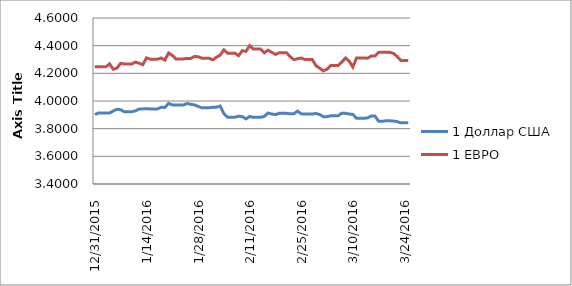
| Category | 1 Доллар США | 1 ЕВРО |
|---|---|---|
| 12/31/15 | 3.902 | 4.247 |
| 1/1/16 | 3.913 | 4.247 |
| 1/2/16 | 3.913 | 4.247 |
| 1/3/16 | 3.913 | 4.247 |
| 1/4/16 | 3.913 | 4.269 |
| 1/5/16 | 3.928 | 4.229 |
| 1/6/16 | 3.941 | 4.238 |
| 1/7/16 | 3.937 | 4.273 |
| 1/8/16 | 3.922 | 4.268 |
| 1/9/16 | 3.922 | 4.268 |
| 1/10/16 | 3.922 | 4.268 |
| 1/11/16 | 3.929 | 4.281 |
| 1/12/16 | 3.942 | 4.274 |
| 1/13/16 | 3.943 | 4.262 |
| 1/14/16 | 3.944 | 4.312 |
| 1/15/16 | 3.943 | 4.303 |
| 1/16/16 | 3.943 | 4.303 |
| 1/17/16 | 3.943 | 4.303 |
| 1/18/16 | 3.955 | 4.31 |
| 1/19/16 | 3.953 | 4.296 |
| 1/20/16 | 3.983 | 4.347 |
| 1/21/16 | 3.972 | 4.33 |
| 1/22/16 | 3.971 | 4.304 |
| 1/23/16 | 3.971 | 4.304 |
| 1/24/16 | 3.971 | 4.304 |
| 1/25/16 | 3.982 | 4.308 |
| 1/26/16 | 3.976 | 4.308 |
| 1/27/16 | 3.972 | 4.322 |
| 1/28/16 | 3.961 | 4.32 |
| 1/29/16 | 3.951 | 4.31 |
| 1/30/16 | 3.951 | 4.31 |
| 1/31/16 | 3.951 | 4.31 |
| 2/1/16 | 3.955 | 4.297 |
| 2/2/16 | 3.955 | 4.317 |
| 2/3/16 | 3.964 | 4.332 |
| 2/4/16 | 3.909 | 4.37 |
| 2/5/16 | 3.883 | 4.346 |
| 2/6/16 | 3.883 | 4.346 |
| 2/7/16 | 3.883 | 4.346 |
| 2/8/16 | 3.89 | 4.327 |
| 2/9/16 | 3.887 | 4.364 |
| 2/10/16 | 3.871 | 4.359 |
| 2/11/16 | 3.888 | 4.4 |
| 2/12/16 | 3.882 | 4.375 |
| 2/13/16 | 3.882 | 4.375 |
| 2/14/16 | 3.882 | 4.375 |
| 2/15/16 | 3.889 | 4.348 |
| 2/16/16 | 3.913 | 4.368 |
| 2/17/16 | 3.906 | 4.352 |
| 2/18/16 | 3.902 | 4.337 |
| 2/19/16 | 3.911 | 4.349 |
| 2/20/16 | 3.911 | 4.349 |
| 2/21/16 | 3.911 | 4.349 |
| 2/22/16 | 3.907 | 4.32 |
| 2/23/16 | 3.907 | 4.299 |
| 2/24/16 | 3.927 | 4.306 |
| 2/25/16 | 3.907 | 4.31 |
| 2/26/16 | 3.906 | 4.299 |
| 2/27/16 | 3.906 | 4.299 |
| 2/28/16 | 3.906 | 4.299 |
| 2/29/16 | 3.91 | 4.255 |
| 3/1/16 | 3.902 | 4.237 |
| 3/2/16 | 3.886 | 4.217 |
| 3/3/16 | 3.887 | 4.23 |
| 3/4/16 | 3.893 | 4.257 |
| 3/5/16 | 3.893 | 4.257 |
| 3/6/16 | 3.893 | 4.257 |
| 3/7/16 | 3.912 | 4.281 |
| 3/8/16 | 3.911 | 4.311 |
| 3/9/16 | 3.906 | 4.288 |
| 3/10/16 | 3.903 | 4.245 |
| 3/11/16 | 3.875 | 4.312 |
| 3/12/16 | 3.875 | 4.312 |
| 3/13/16 | 3.875 | 4.312 |
| 3/14/16 | 3.878 | 4.309 |
| 3/15/16 | 3.891 | 4.326 |
| 3/16/16 | 3.891 | 4.326 |
| 3/17/16 | 3.853 | 4.352 |
| 3/18/16 | 3.853 | 4.352 |
| 3/19/16 | 3.857 | 4.352 |
| 3/20/16 | 3.857 | 4.352 |
| 3/21/16 | 3.855 | 4.345 |
| 3/22/16 | 3.851 | 4.322 |
| 3/23/16 | 3.842 | 4.293 |
| 3/24/16 | 3.842 | 4.293 |
| 3/25/16 | 3.842 | 4.293 |